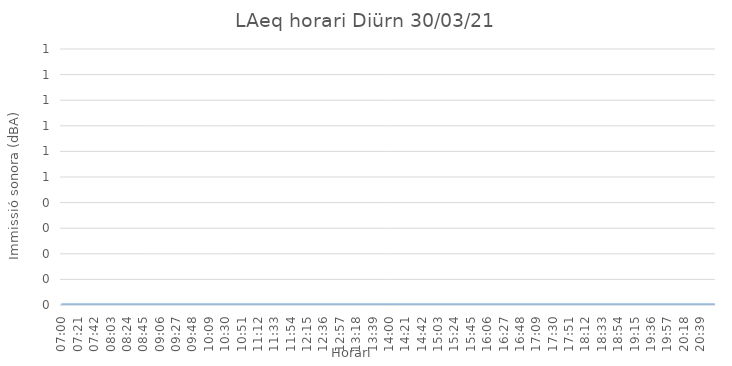
| Category | LAeq horari Diürn 30/03/21 |
|---|---|
| 07:00 | 0 |
| 07:01 | 0 |
| 07:02 | 0 |
| 07:03 | 0 |
| 07:04 | 0 |
| 07:05 | 0 |
| 07:06 | 0 |
| 07:07 | 0 |
| 07:08 | 0 |
| 07:09 | 0 |
| 07:10 | 0 |
| 07:11 | 0 |
| 07:12 | 0 |
| 07:13 | 0 |
| 07:14 | 0 |
| 07:15 | 0 |
| 07:16 | 0 |
| 07:17 | 0 |
| 07:18 | 0 |
| 07:19 | 0 |
| 07:20 | 0 |
| 07:21 | 0 |
| 07:22 | 0 |
| 07:23 | 0 |
| 07:24 | 0 |
| 07:25 | 0 |
| 07:26 | 0 |
| 07:27 | 0 |
| 07:28 | 0 |
| 07:29 | 0 |
| 07:30 | 0 |
| 07:31 | 0 |
| 07:32 | 0 |
| 07:33 | 0 |
| 07:34 | 0 |
| 07:35 | 0 |
| 07:36 | 0 |
| 07:37 | 0 |
| 07:38 | 0 |
| 07:39 | 0 |
| 07:40 | 0 |
| 07:41 | 0 |
| 07:42 | 0 |
| 07:43 | 0 |
| 07:44 | 0 |
| 07:45 | 0 |
| 07:46 | 0 |
| 07:47 | 0 |
| 07:48 | 0 |
| 07:49 | 0 |
| 07:50 | 0 |
| 07:51 | 0 |
| 07:52 | 0 |
| 07:53 | 0 |
| 07:54 | 0 |
| 07:55 | 0 |
| 07:56 | 0 |
| 07:57 | 0 |
| 07:58 | 0 |
| 07:59 | 0 |
| 08:00 | 0 |
| 08:01 | 0 |
| 08:02 | 0 |
| 08:03 | 0 |
| 08:04 | 0 |
| 08:05 | 0 |
| 08:06 | 0 |
| 08:07 | 0 |
| 08:08 | 0 |
| 08:09 | 0 |
| 08:10 | 0 |
| 08:11 | 0 |
| 08:12 | 0 |
| 08:13 | 0 |
| 08:14 | 0 |
| 08:15 | 0 |
| 08:16 | 0 |
| 08:17 | 0 |
| 08:18 | 0 |
| 08:19 | 0 |
| 08:20 | 0 |
| 08:21 | 0 |
| 08:22 | 0 |
| 08:23 | 0 |
| 08:24 | 0 |
| 08:25 | 0 |
| 08:26 | 0 |
| 08:27 | 0 |
| 08:28 | 0 |
| 08:29 | 0 |
| 08:30 | 0 |
| 08:31 | 0 |
| 08:32 | 0 |
| 08:33 | 0 |
| 08:34 | 0 |
| 08:35 | 0 |
| 08:36 | 0 |
| 08:37 | 0 |
| 08:38 | 0 |
| 08:39 | 0 |
| 08:40 | 0 |
| 08:41 | 0 |
| 08:42 | 0 |
| 08:43 | 0 |
| 08:44 | 0 |
| 08:45 | 0 |
| 08:46 | 0 |
| 08:47 | 0 |
| 08:48 | 0 |
| 08:49 | 0 |
| 08:50 | 0 |
| 08:51 | 0 |
| 08:52 | 0 |
| 08:53 | 0 |
| 08:54 | 0 |
| 08:55 | 0 |
| 08:56 | 0 |
| 08:57 | 0 |
| 08:58 | 0 |
| 08:59 | 0 |
| 09:00 | 0 |
| 09:01 | 0 |
| 09:02 | 0 |
| 09:03 | 0 |
| 09:04 | 0 |
| 09:05 | 0 |
| 09:06 | 0 |
| 09:07 | 0 |
| 09:08 | 0 |
| 09:09 | 0 |
| 09:10 | 0 |
| 09:11 | 0 |
| 09:12 | 0 |
| 09:13 | 0 |
| 09:14 | 0 |
| 09:15 | 0 |
| 09:16 | 0 |
| 09:17 | 0 |
| 09:18 | 0 |
| 09:19 | 0 |
| 09:20 | 0 |
| 09:21 | 0 |
| 09:22 | 0 |
| 09:23 | 0 |
| 09:24 | 0 |
| 09:25 | 0 |
| 09:26 | 0 |
| 09:27 | 0 |
| 09:28 | 0 |
| 09:29 | 0 |
| 09:30 | 0 |
| 09:31 | 0 |
| 09:32 | 0 |
| 09:33 | 0 |
| 09:34 | 0 |
| 09:35 | 0 |
| 09:36 | 0 |
| 09:37 | 0 |
| 09:38 | 0 |
| 09:39 | 0 |
| 09:40 | 0 |
| 09:41 | 0 |
| 09:42 | 0 |
| 09:43 | 0 |
| 09:44 | 0 |
| 09:45 | 0 |
| 09:46 | 0 |
| 09:47 | 0 |
| 09:48 | 0 |
| 09:49 | 0 |
| 09:50 | 0 |
| 09:51 | 0 |
| 09:52 | 0 |
| 09:53 | 0 |
| 09:54 | 0 |
| 09:55 | 0 |
| 09:56 | 0 |
| 09:57 | 0 |
| 09:58 | 0 |
| 09:59 | 0 |
| 10:00 | 0 |
| 10:01 | 0 |
| 10:02 | 0 |
| 10:03 | 0 |
| 10:04 | 0 |
| 10:05 | 0 |
| 10:06 | 0 |
| 10:07 | 0 |
| 10:08 | 0 |
| 10:09 | 0 |
| 10:10 | 0 |
| 10:11 | 0 |
| 10:12 | 0 |
| 10:13 | 0 |
| 10:14 | 0 |
| 10:15 | 0 |
| 10:16 | 0 |
| 10:17 | 0 |
| 10:18 | 0 |
| 10:19 | 0 |
| 10:20 | 0 |
| 10:21 | 0 |
| 10:22 | 0 |
| 10:23 | 0 |
| 10:24 | 0 |
| 10:25 | 0 |
| 10:26 | 0 |
| 10:27 | 0 |
| 10:28 | 0 |
| 10:29 | 0 |
| 10:30 | 0 |
| 10:31 | 0 |
| 10:32 | 0 |
| 10:33 | 0 |
| 10:34 | 0 |
| 10:35 | 0 |
| 10:36 | 0 |
| 10:37 | 0 |
| 10:38 | 0 |
| 10:39 | 0 |
| 10:40 | 0 |
| 10:41 | 0 |
| 10:42 | 0 |
| 10:43 | 0 |
| 10:44 | 0 |
| 10:45 | 0 |
| 10:46 | 0 |
| 10:47 | 0 |
| 10:48 | 0 |
| 10:49 | 0 |
| 10:50 | 0 |
| 10:51 | 0 |
| 10:52 | 0 |
| 10:53 | 0 |
| 10:54 | 0 |
| 10:55 | 0 |
| 10:56 | 0 |
| 10:57 | 0 |
| 10:58 | 0 |
| 10:59 | 0 |
| 11:00 | 0 |
| 11:01 | 0 |
| 11:02 | 0 |
| 11:03 | 0 |
| 11:04 | 0 |
| 11:05 | 0 |
| 11:06 | 0 |
| 11:07 | 0 |
| 11:08 | 0 |
| 11:09 | 0 |
| 11:10 | 0 |
| 11:11 | 0 |
| 11:12 | 0 |
| 11:13 | 0 |
| 11:14 | 0 |
| 11:15 | 0 |
| 11:16 | 0 |
| 11:17 | 0 |
| 11:18 | 0 |
| 11:19 | 0 |
| 11:20 | 0 |
| 11:21 | 0 |
| 11:22 | 0 |
| 11:23 | 0 |
| 11:24 | 0 |
| 11:25 | 0 |
| 11:26 | 0 |
| 11:27 | 0 |
| 11:28 | 0 |
| 11:29 | 0 |
| 11:30 | 0 |
| 11:31 | 0 |
| 11:32 | 0 |
| 11:33 | 0 |
| 11:34 | 0 |
| 11:35 | 0 |
| 11:36 | 0 |
| 11:37 | 0 |
| 11:38 | 0 |
| 11:39 | 0 |
| 11:40 | 0 |
| 11:41 | 0 |
| 11:42 | 0 |
| 11:43 | 0 |
| 11:44 | 0 |
| 11:45 | 0 |
| 11:46 | 0 |
| 11:47 | 0 |
| 11:48 | 0 |
| 11:49 | 0 |
| 11:50 | 0 |
| 11:51 | 0 |
| 11:52 | 0 |
| 11:53 | 0 |
| 11:54 | 0 |
| 11:55 | 0 |
| 11:56 | 0 |
| 11:57 | 0 |
| 11:58 | 0 |
| 11:59 | 0 |
| 12:00 | 0 |
| 12:01 | 0 |
| 12:02 | 0 |
| 12:03 | 0 |
| 12:04 | 0 |
| 12:05 | 0 |
| 12:06 | 0 |
| 12:07 | 0 |
| 12:08 | 0 |
| 12:09 | 0 |
| 12:10 | 0 |
| 12:11 | 0 |
| 12:12 | 0 |
| 12:13 | 0 |
| 12:14 | 0 |
| 12:15 | 0 |
| 12:16 | 0 |
| 12:17 | 0 |
| 12:18 | 0 |
| 12:19 | 0 |
| 12:20 | 0 |
| 12:21 | 0 |
| 12:22 | 0 |
| 12:23 | 0 |
| 12:24 | 0 |
| 12:25 | 0 |
| 12:26 | 0 |
| 12:27 | 0 |
| 12:28 | 0 |
| 12:29 | 0 |
| 12:30 | 0 |
| 12:31 | 0 |
| 12:32 | 0 |
| 12:33 | 0 |
| 12:34 | 0 |
| 12:35 | 0 |
| 12:36 | 0 |
| 12:37 | 0 |
| 12:38 | 0 |
| 12:39 | 0 |
| 12:40 | 0 |
| 12:41 | 0 |
| 12:42 | 0 |
| 12:43 | 0 |
| 12:44 | 0 |
| 12:45 | 0 |
| 12:46 | 0 |
| 12:47 | 0 |
| 12:48 | 0 |
| 12:49 | 0 |
| 12:50 | 0 |
| 12:51 | 0 |
| 12:52 | 0 |
| 12:53 | 0 |
| 12:54 | 0 |
| 12:55 | 0 |
| 12:56 | 0 |
| 12:57 | 0 |
| 12:58 | 0 |
| 12:59 | 0 |
| 13:00 | 0 |
| 13:01 | 0 |
| 13:02 | 0 |
| 13:03 | 0 |
| 13:04 | 0 |
| 13:05 | 0 |
| 13:06 | 0 |
| 13:07 | 0 |
| 13:08 | 0 |
| 13:09 | 0 |
| 13:10 | 0 |
| 13:11 | 0 |
| 13:12 | 0 |
| 13:13 | 0 |
| 13:14 | 0 |
| 13:15 | 0 |
| 13:16 | 0 |
| 13:17 | 0 |
| 13:18 | 0 |
| 13:19 | 0 |
| 13:20 | 0 |
| 13:21 | 0 |
| 13:22 | 0 |
| 13:23 | 0 |
| 13:24 | 0 |
| 13:25 | 0 |
| 13:26 | 0 |
| 13:27 | 0 |
| 13:28 | 0 |
| 13:29 | 0 |
| 13:30 | 0 |
| 13:31 | 0 |
| 13:32 | 0 |
| 13:33 | 0 |
| 13:34 | 0 |
| 13:35 | 0 |
| 13:36 | 0 |
| 13:37 | 0 |
| 13:38 | 0 |
| 13:39 | 0 |
| 13:40 | 0 |
| 13:41 | 0 |
| 13:42 | 0 |
| 13:43 | 0 |
| 13:44 | 0 |
| 13:45 | 0 |
| 13:46 | 0 |
| 13:47 | 0 |
| 13:48 | 0 |
| 13:49 | 0 |
| 13:50 | 0 |
| 13:51 | 0 |
| 13:52 | 0 |
| 13:53 | 0 |
| 13:54 | 0 |
| 13:55 | 0 |
| 13:56 | 0 |
| 13:57 | 0 |
| 13:58 | 0 |
| 13:59 | 0 |
| 14:00 | 0 |
| 14:01 | 0 |
| 14:02 | 0 |
| 14:03 | 0 |
| 14:04 | 0 |
| 14:05 | 0 |
| 14:06 | 0 |
| 14:07 | 0 |
| 14:08 | 0 |
| 14:09 | 0 |
| 14:10 | 0 |
| 14:11 | 0 |
| 14:12 | 0 |
| 14:13 | 0 |
| 14:14 | 0 |
| 14:15 | 0 |
| 14:16 | 0 |
| 14:17 | 0 |
| 14:18 | 0 |
| 14:19 | 0 |
| 14:20 | 0 |
| 14:21 | 0 |
| 14:22 | 0 |
| 14:23 | 0 |
| 14:24 | 0 |
| 14:25 | 0 |
| 14:26 | 0 |
| 14:27 | 0 |
| 14:28 | 0 |
| 14:29 | 0 |
| 14:30 | 0 |
| 14:31 | 0 |
| 14:32 | 0 |
| 14:33 | 0 |
| 14:34 | 0 |
| 14:35 | 0 |
| 14:36 | 0 |
| 14:37 | 0 |
| 14:38 | 0 |
| 14:39 | 0 |
| 14:40 | 0 |
| 14:41 | 0 |
| 14:42 | 0 |
| 14:43 | 0 |
| 14:44 | 0 |
| 14:45 | 0 |
| 14:46 | 0 |
| 14:47 | 0 |
| 14:48 | 0 |
| 14:49 | 0 |
| 14:50 | 0 |
| 14:51 | 0 |
| 14:52 | 0 |
| 14:53 | 0 |
| 14:54 | 0 |
| 14:55 | 0 |
| 14:56 | 0 |
| 14:57 | 0 |
| 14:58 | 0 |
| 14:59 | 0 |
| 15:00 | 0 |
| 15:01 | 0 |
| 15:02 | 0 |
| 15:03 | 0 |
| 15:04 | 0 |
| 15:05 | 0 |
| 15:06 | 0 |
| 15:07 | 0 |
| 15:08 | 0 |
| 15:09 | 0 |
| 15:10 | 0 |
| 15:11 | 0 |
| 15:12 | 0 |
| 15:13 | 0 |
| 15:14 | 0 |
| 15:15 | 0 |
| 15:16 | 0 |
| 15:17 | 0 |
| 15:18 | 0 |
| 15:19 | 0 |
| 15:20 | 0 |
| 15:21 | 0 |
| 15:22 | 0 |
| 15:23 | 0 |
| 15:24 | 0 |
| 15:25 | 0 |
| 15:26 | 0 |
| 15:27 | 0 |
| 15:28 | 0 |
| 15:29 | 0 |
| 15:30 | 0 |
| 15:31 | 0 |
| 15:32 | 0 |
| 15:33 | 0 |
| 15:34 | 0 |
| 15:35 | 0 |
| 15:36 | 0 |
| 15:37 | 0 |
| 15:38 | 0 |
| 15:39 | 0 |
| 15:40 | 0 |
| 15:41 | 0 |
| 15:42 | 0 |
| 15:43 | 0 |
| 15:44 | 0 |
| 15:45 | 0 |
| 15:46 | 0 |
| 15:47 | 0 |
| 15:48 | 0 |
| 15:49 | 0 |
| 15:50 | 0 |
| 15:51 | 0 |
| 15:52 | 0 |
| 15:53 | 0 |
| 15:54 | 0 |
| 15:55 | 0 |
| 15:56 | 0 |
| 15:57 | 0 |
| 15:58 | 0 |
| 15:59 | 0 |
| 16:00 | 0 |
| 16:01 | 0 |
| 16:02 | 0 |
| 16:03 | 0 |
| 16:04 | 0 |
| 16:05 | 0 |
| 16:06 | 0 |
| 16:07 | 0 |
| 16:08 | 0 |
| 16:09 | 0 |
| 16:10 | 0 |
| 16:11 | 0 |
| 16:12 | 0 |
| 16:13 | 0 |
| 16:14 | 0 |
| 16:15 | 0 |
| 16:16 | 0 |
| 16:17 | 0 |
| 16:18 | 0 |
| 16:19 | 0 |
| 16:20 | 0 |
| 16:21 | 0 |
| 16:22 | 0 |
| 16:23 | 0 |
| 16:24 | 0 |
| 16:25 | 0 |
| 16:26 | 0 |
| 16:27 | 0 |
| 16:28 | 0 |
| 16:29 | 0 |
| 16:30 | 0 |
| 16:31 | 0 |
| 16:32 | 0 |
| 16:33 | 0 |
| 16:34 | 0 |
| 16:35 | 0 |
| 16:36 | 0 |
| 16:37 | 0 |
| 16:38 | 0 |
| 16:39 | 0 |
| 16:40 | 0 |
| 16:41 | 0 |
| 16:42 | 0 |
| 16:43 | 0 |
| 16:44 | 0 |
| 16:45 | 0 |
| 16:46 | 0 |
| 16:47 | 0 |
| 16:48 | 0 |
| 16:49 | 0 |
| 16:50 | 0 |
| 16:51 | 0 |
| 16:52 | 0 |
| 16:53 | 0 |
| 16:54 | 0 |
| 16:55 | 0 |
| 16:56 | 0 |
| 16:57 | 0 |
| 16:58 | 0 |
| 16:59 | 0 |
| 17:00 | 0 |
| 17:01 | 0 |
| 17:02 | 0 |
| 17:03 | 0 |
| 17:04 | 0 |
| 17:05 | 0 |
| 17:06 | 0 |
| 17:07 | 0 |
| 17:08 | 0 |
| 17:09 | 0 |
| 17:10 | 0 |
| 17:11 | 0 |
| 17:12 | 0 |
| 17:13 | 0 |
| 17:14 | 0 |
| 17:15 | 0 |
| 17:16 | 0 |
| 17:17 | 0 |
| 17:18 | 0 |
| 17:19 | 0 |
| 17:20 | 0 |
| 17:21 | 0 |
| 17:22 | 0 |
| 17:23 | 0 |
| 17:24 | 0 |
| 17:25 | 0 |
| 17:26 | 0 |
| 17:27 | 0 |
| 17:28 | 0 |
| 17:29 | 0 |
| 17:30 | 0 |
| 17:31 | 0 |
| 17:32 | 0 |
| 17:33 | 0 |
| 17:34 | 0 |
| 17:35 | 0 |
| 17:36 | 0 |
| 17:37 | 0 |
| 17:38 | 0 |
| 17:39 | 0 |
| 17:40 | 0 |
| 17:41 | 0 |
| 17:42 | 0 |
| 17:43 | 0 |
| 17:44 | 0 |
| 17:45 | 0 |
| 17:46 | 0 |
| 17:47 | 0 |
| 17:48 | 0 |
| 17:49 | 0 |
| 17:50 | 0 |
| 17:51 | 0 |
| 17:52 | 0 |
| 17:53 | 0 |
| 17:54 | 0 |
| 17:55 | 0 |
| 17:56 | 0 |
| 17:57 | 0 |
| 17:58 | 0 |
| 17:59 | 0 |
| 18:00 | 0 |
| 18:01 | 0 |
| 18:02 | 0 |
| 18:03 | 0 |
| 18:04 | 0 |
| 18:05 | 0 |
| 18:06 | 0 |
| 18:07 | 0 |
| 18:08 | 0 |
| 18:09 | 0 |
| 18:10 | 0 |
| 18:11 | 0 |
| 18:12 | 0 |
| 18:13 | 0 |
| 18:14 | 0 |
| 18:15 | 0 |
| 18:16 | 0 |
| 18:17 | 0 |
| 18:18 | 0 |
| 18:19 | 0 |
| 18:20 | 0 |
| 18:21 | 0 |
| 18:22 | 0 |
| 18:23 | 0 |
| 18:24 | 0 |
| 18:25 | 0 |
| 18:26 | 0 |
| 18:27 | 0 |
| 18:28 | 0 |
| 18:29 | 0 |
| 18:30 | 0 |
| 18:31 | 0 |
| 18:32 | 0 |
| 18:33 | 0 |
| 18:34 | 0 |
| 18:35 | 0 |
| 18:36 | 0 |
| 18:37 | 0 |
| 18:38 | 0 |
| 18:39 | 0 |
| 18:40 | 0 |
| 18:41 | 0 |
| 18:42 | 0 |
| 18:43 | 0 |
| 18:44 | 0 |
| 18:45 | 0 |
| 18:46 | 0 |
| 18:47 | 0 |
| 18:48 | 0 |
| 18:49 | 0 |
| 18:50 | 0 |
| 18:51 | 0 |
| 18:52 | 0 |
| 18:53 | 0 |
| 18:54 | 0 |
| 18:55 | 0 |
| 18:56 | 0 |
| 18:57 | 0 |
| 18:58 | 0 |
| 18:59 | 0 |
| 19:00 | 0 |
| 19:01 | 0 |
| 19:02 | 0 |
| 19:03 | 0 |
| 19:04 | 0 |
| 19:05 | 0 |
| 19:06 | 0 |
| 19:07 | 0 |
| 19:08 | 0 |
| 19:09 | 0 |
| 19:10 | 0 |
| 19:11 | 0 |
| 19:12 | 0 |
| 19:13 | 0 |
| 19:14 | 0 |
| 19:15 | 0 |
| 19:16 | 0 |
| 19:17 | 0 |
| 19:18 | 0 |
| 19:19 | 0 |
| 19:20 | 0 |
| 19:21 | 0 |
| 19:22 | 0 |
| 19:23 | 0 |
| 19:24 | 0 |
| 19:25 | 0 |
| 19:26 | 0 |
| 19:27 | 0 |
| 19:28 | 0 |
| 19:29 | 0 |
| 19:30 | 0 |
| 19:31 | 0 |
| 19:32 | 0 |
| 19:33 | 0 |
| 19:34 | 0 |
| 19:35 | 0 |
| 19:36 | 0 |
| 19:37 | 0 |
| 19:38 | 0 |
| 19:39 | 0 |
| 19:40 | 0 |
| 19:41 | 0 |
| 19:42 | 0 |
| 19:43 | 0 |
| 19:44 | 0 |
| 19:45 | 0 |
| 19:46 | 0 |
| 19:47 | 0 |
| 19:48 | 0 |
| 19:49 | 0 |
| 19:50 | 0 |
| 19:51 | 0 |
| 19:52 | 0 |
| 19:53 | 0 |
| 19:54 | 0 |
| 19:55 | 0 |
| 19:56 | 0 |
| 19:57 | 0 |
| 19:58 | 0 |
| 19:59 | 0 |
| 20:00 | 0 |
| 20:01 | 0 |
| 20:02 | 0 |
| 20:03 | 0 |
| 20:04 | 0 |
| 20:05 | 0 |
| 20:06 | 0 |
| 20:07 | 0 |
| 20:08 | 0 |
| 20:09 | 0 |
| 20:10 | 0 |
| 20:11 | 0 |
| 20:12 | 0 |
| 20:13 | 0 |
| 20:14 | 0 |
| 20:15 | 0 |
| 20:16 | 0 |
| 20:17 | 0 |
| 20:18 | 0 |
| 20:19 | 0 |
| 20:20 | 0 |
| 20:21 | 0 |
| 20:22 | 0 |
| 20:23 | 0 |
| 20:24 | 0 |
| 20:25 | 0 |
| 20:26 | 0 |
| 20:27 | 0 |
| 20:28 | 0 |
| 20:29 | 0 |
| 20:30 | 0 |
| 20:31 | 0 |
| 20:32 | 0 |
| 20:33 | 0 |
| 20:34 | 0 |
| 20:35 | 0 |
| 20:36 | 0 |
| 20:37 | 0 |
| 20:38 | 0 |
| 20:39 | 0 |
| 20:40 | 0 |
| 20:41 | 0 |
| 20:42 | 0 |
| 20:43 | 0 |
| 20:44 | 0 |
| 20:45 | 0 |
| 20:46 | 0 |
| 20:47 | 0 |
| 20:48 | 0 |
| 20:49 | 0 |
| 20:50 | 0 |
| 20:51 | 0 |
| 20:52 | 0 |
| 20:53 | 0 |
| 20:54 | 0 |
| 20:55 | 0 |
| 20:56 | 0 |
| 20:57 | 0 |
| 20:58 | 0 |
| 20:59 | 0 |